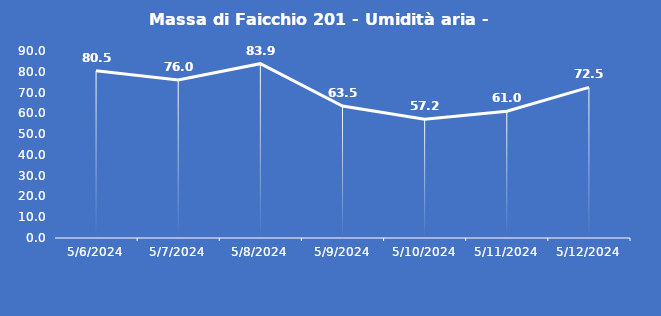
| Category | Massa di Faicchio 201 - Umidità aria - Grezzo (%) |
|---|---|
| 5/6/24 | 80.5 |
| 5/7/24 | 76 |
| 5/8/24 | 83.9 |
| 5/9/24 | 63.5 |
| 5/10/24 | 57.2 |
| 5/11/24 | 61 |
| 5/12/24 | 72.5 |